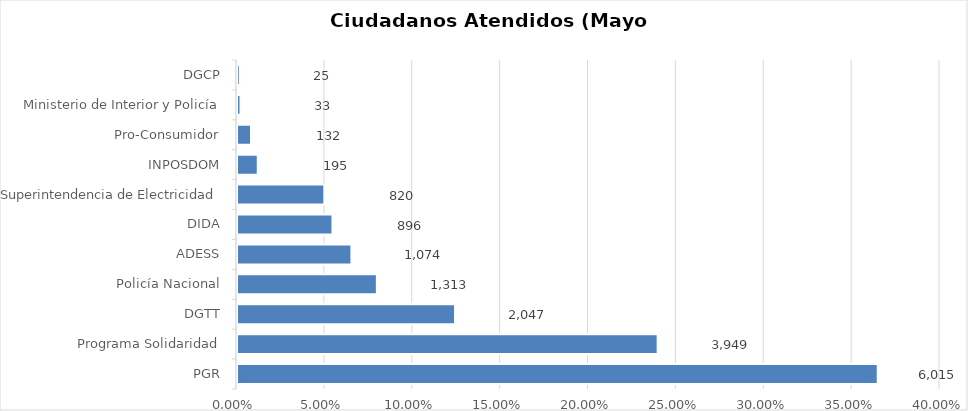
| Category | Porcentaje |
|---|---|
| PGR | 0.365 |
| Programa Solidaridad | 0.239 |
| DGTT | 0.124 |
| Policía Nacional | 0.08 |
| ADESS | 0.065 |
| DIDA | 0.054 |
| Superintendencia de Electricidad | 0.05 |
| INPOSDOM | 0.012 |
| Pro-Consumidor | 0.008 |
| Ministerio de Interior y Policía | 0.002 |
| DGCP | 0.002 |